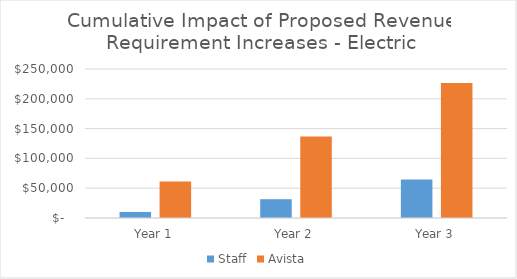
| Category | Staff | Avista |
|---|---|---|
| Year 1 | 10034.115 | 61356 |
| Year 2 | 31518.526 | 136695 |
| Year 3 | 64718.472 | 226466 |